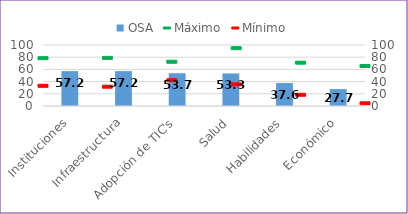
| Category | OSA |
|---|---|
| Instituciones | 57.215 |
| Infraestructura | 57.182 |
| Adopción de TIC's | 53.706 |
| Salud | 53.333 |
| Habilidades | 37.639 |
| Económico | 27.75 |